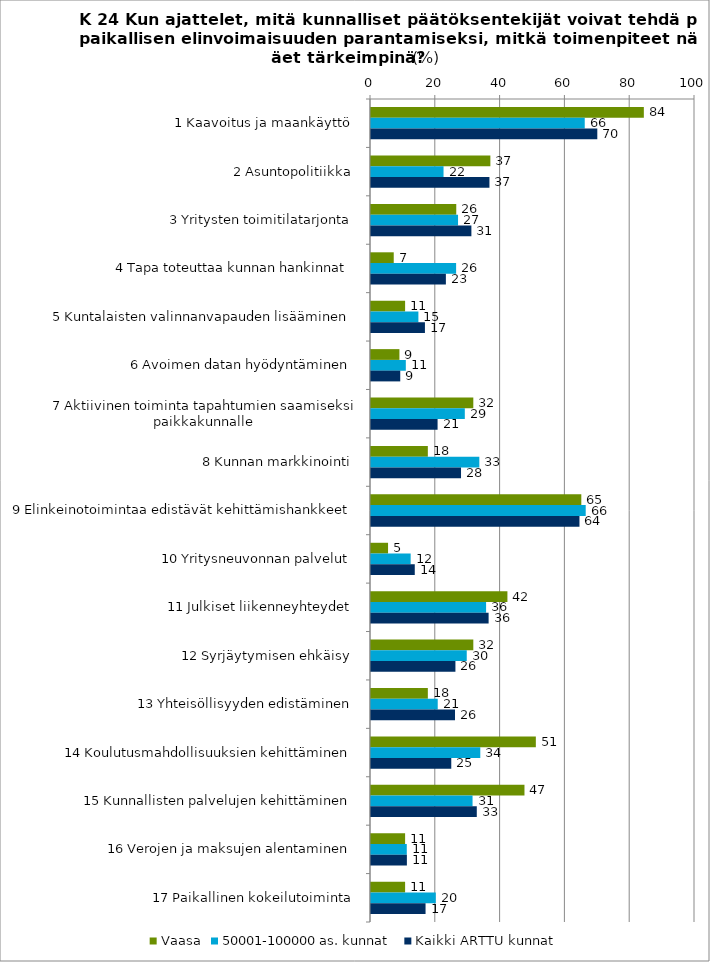
| Category | Vaasa | 50001-100000 as. kunnat | Kaikki ARTTU kunnat |
|---|---|---|---|
| 1 Kaavoitus ja maankäyttö  | 84.211 | 65.97 | 69.846 |
| 2 Asuntopolitiikka  | 36.842 | 22.388 | 36.556 |
| 3 Yritysten toimitilatarjonta  | 26.316 | 26.866 | 30.986 |
| 4 Tapa toteuttaa kunnan hankinnat  | 7.018 | 26.269 | 23.111 |
| 5 Kuntalaisten valinnanvapauden lisääminen  | 10.526 | 14.627 | 16.645 |
| 6 Avoimen datan hyödyntäminen  | 8.772 | 10.746 | 9.027 |
| 7 Aktiivinen toiminta tapahtumien saamiseksi paikkakunnalle  | 31.579 | 28.955 | 20.551 |
| 8 Kunnan markkinointi  | 17.544 | 33.433 | 27.785 |
| 9 Elinkeinotoimintaa edistävät kehittämishankkeet  | 64.912 | 66.269 | 64.341 |
| 10 Yritysneuvonnan palvelut  | 5.263 | 12.239 | 13.508 |
| 11 Julkiset liikenneyhteydet  | 42.105 | 35.522 | 36.3 |
| 12 Syrjäytymisen ehkäisy  | 31.579 | 29.552 | 26.056 |
| 13 Yhteisöllisyyden edistäminen  | 17.544 | 20.597 | 25.928 |
| 14 Koulutusmahdollisuuksien kehittäminen  | 50.877 | 33.731 | 24.776 |
| 15 Kunnallisten palvelujen kehittäminen  | 47.368 | 31.343 | 32.65 |
| 16 Verojen ja maksujen alentaminen  | 10.526 | 11.045 | 11.076 |
| 17 Paikallinen kokeilutoiminta  | 10.526 | 20 | 16.837 |